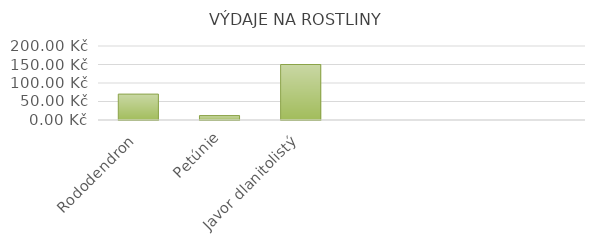
| Category | Rododendron |
|---|---|
| Rododendron | 70 |
| Petúnie | 11.94 |
| Javor dlanitolistý | 150 |